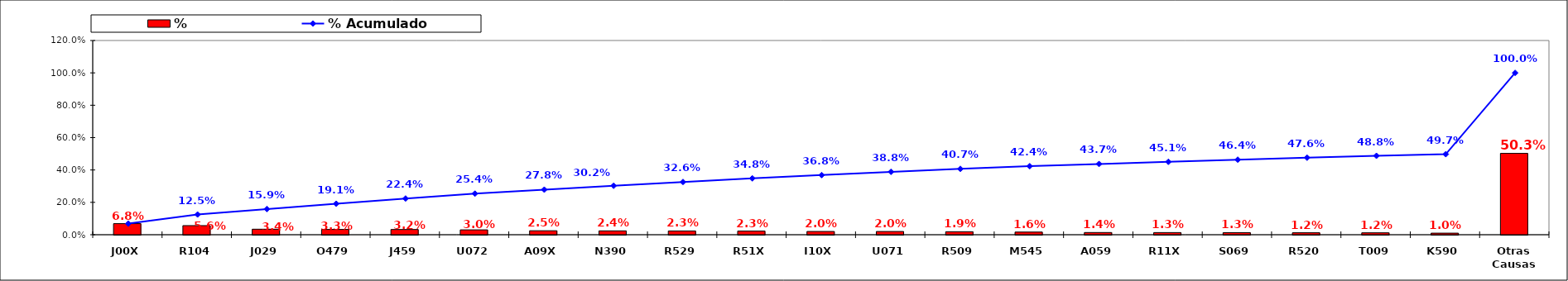
| Category | % |
|---|---|
| J00X | 0.068 |
| R104 | 0.056 |
| J029 | 0.034 |
| O479 | 0.033 |
| J459 | 0.032 |
| U072 | 0.03 |
| A09X | 0.025 |
| N390 | 0.024 |
| R529 | 0.023 |
| R51X | 0.023 |
| I10X | 0.02 |
| U071 | 0.02 |
| R509 | 0.019 |
| M545 | 0.016 |
| A059 | 0.014 |
| R11X | 0.013 |
| S069 | 0.013 |
| R520 | 0.012 |
| T009 | 0.012 |
| K590 | 0.01 |
| Otras Causas | 0.503 |